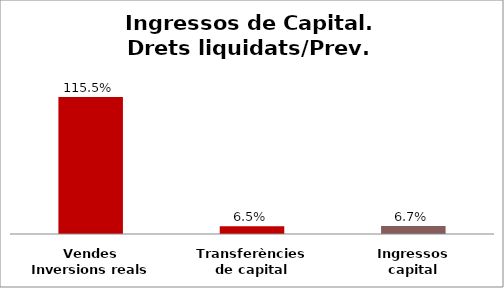
| Category | Series 0 |
|---|---|
| Vendes Inversions reals | 1.155 |
| Transferències de capital | 0.065 |
| Ingressos capital | 0.067 |